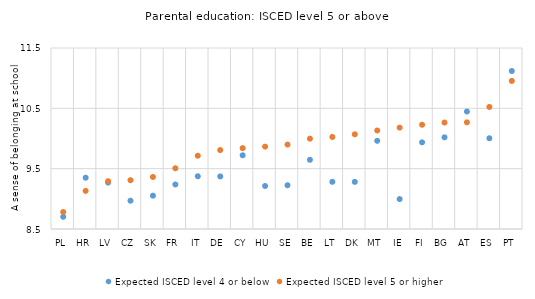
| Category | Expected ISCED level 4 or below | Expected ISCED level 5 or higher |
|---|---|---|
| PL | 8.702 | 8.782 |
| HR | 9.35 | 9.131 |
| LV | 9.269 | 9.293 |
| CZ | 8.968 | 9.309 |
| SK | 9.052 | 9.362 |
| FR | 9.238 | 9.507 |
| IT | 9.374 | 9.715 |
| DE | 9.371 | 9.809 |
| CY | 9.722 | 9.84 |
| HU | 9.213 | 9.866 |
| SE | 9.225 | 9.899 |
| BE | 9.646 | 9.997 |
| LT | 9.282 | 10.025 |
| DK | 9.281 | 10.07 |
| MT | 9.962 | 10.133 |
| IE | 8.996 | 10.181 |
| FI | 9.936 | 10.228 |
| BG | 10.02 | 10.265 |
| AT | 10.447 | 10.268 |
| ES | 10.004 | 10.523 |
| PT | 11.119 | 10.955 |